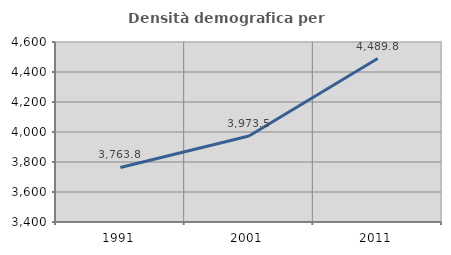
| Category | Densità demografica |
|---|---|
| 1991.0 | 3763.847 |
| 2001.0 | 3973.516 |
| 2011.0 | 4489.835 |